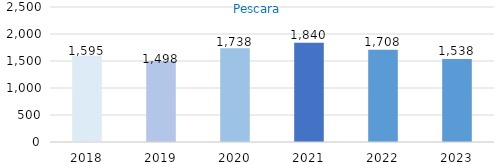
| Category | Series 0 |
|---|---|
| 2018.0 | 1595 |
| 2019.0 | 1498 |
| 2020.0 | 1738 |
| 2021.0 | 1840 |
| 2022.0 | 1708 |
| 2023.0 | 1538 |